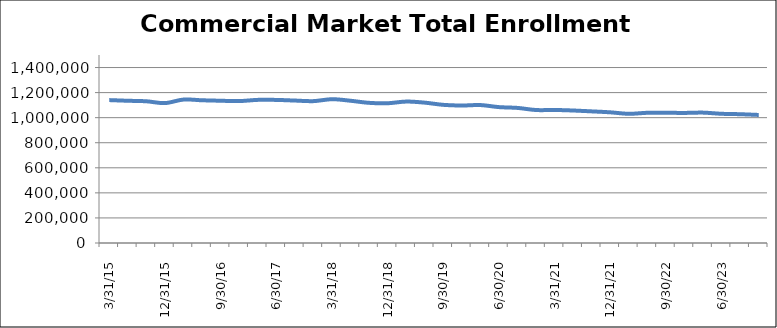
| Category | Total |
|---|---|
| 3/31/15 | 1140242 |
| 6/30/15 | 1134809 |
| 9/30/15 | 1130673 |
| 12/31/15 | 1116285 |
| 3/31/16 | 1144457 |
| 6/30/16 | 1138685 |
| 9/30/16 | 1135067 |
| 12/31/16 | 1132219 |
| 3/31/17 | 1141949 |
| 6/30/17 | 1141689 |
| 9/30/17 | 1136520 |
| 12/31/17 | 1131933 |
| 3/31/18 | 1147331 |
| 6/30/18 | 1135044 |
| 9/30/18 | 1118272 |
| 12/31/18 | 1114919 |
| 3/31/19 | 1128446 |
| 6/30/19 | 1119825 |
| 9/30/19 | 1102270 |
| 12/31/19 | 1096869 |
| 3/31/20 | 1100571 |
| 6/30/20 | 1084205 |
| 9/30/20 | 1077849 |
| 12/31/20 | 1060893 |
| 3/31/21 | 1061377 |
| 6/30/21 | 1057169 |
| 9/30/21 | 1050197 |
| 12/31/21 | 1042661 |
| 3/31/22 | 1030778 |
| 6/30/22 | 1038875 |
| 9/30/22 | 1038978 |
| 12/31/22 | 1037906 |
| 3/31/23 | 1040225 |
| 6/30/23 | 1030842 |
| 9/30/23 | 1027610 |
| 12/31/23 | 1021684 |